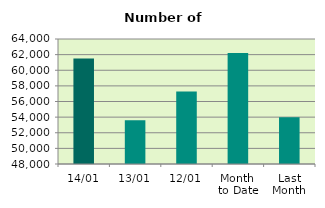
| Category | Series 0 |
|---|---|
| 14/01 | 61518 |
| 13/01 | 53602 |
| 12/01 | 57282 |
| Month 
to Date | 62211.333 |
| Last
Month | 53997.143 |